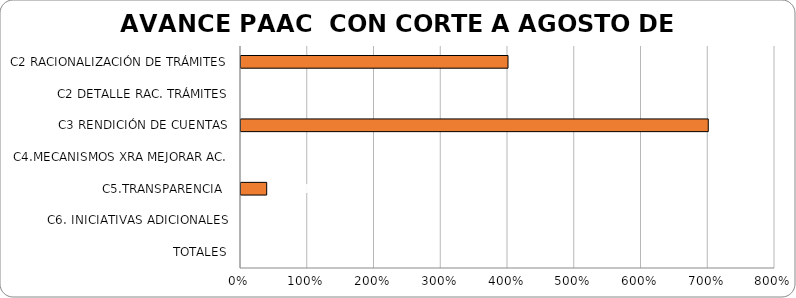
| Category | % AVANCE |
|---|---|
| C2 RACIONALIZACIÓN DE TRÁMITES | 4 |
| C2 DETALLE RAC. TRÁMITES | 0 |
| C3 RENDICIÓN DE CUENTAS | 7 |
| C4.MECANISMOS XRA MEJORAR AC. | 0 |
| C5.TRANSPARENCIA  | 0.385 |
| C6. INICIATIVAS ADICIONALES | 0 |
| TOTALES | 0 |